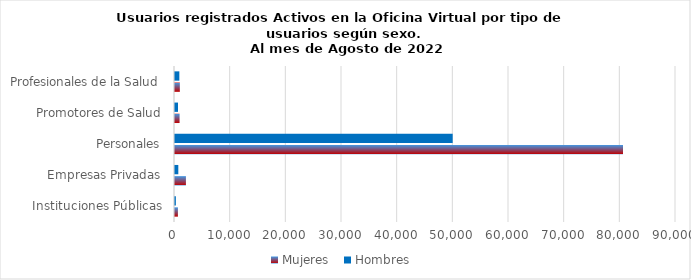
| Category | Mujeres | Hombres |
|---|---|---|
| Instituciones Públicas | 524 | 154 |
| Empresas Privadas | 1962 | 595 |
| Personales | 80480 | 49882 |
| Promotores de Salud | 821 | 536 |
| Profesionales de la Salud | 870 | 780 |